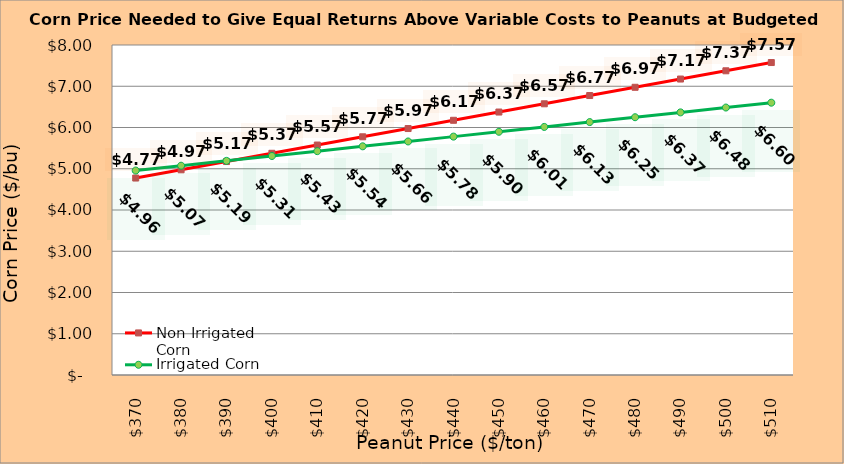
| Category | Non Irrigated Corn | Irrigated Corn |
|---|---|---|
| 370.0 | 4.775 | 4.956 |
| 380.0 | 4.975 | 5.074 |
| 390.0 | 5.175 | 5.191 |
| 400.0 | 5.375 | 5.309 |
| 410.0 | 5.575 | 5.426 |
| 420.0 | 5.775 | 5.544 |
| 430.0 | 5.975 | 5.661 |
| 440.0 | 6.175 | 5.779 |
| 450.0 | 6.375 | 5.896 |
| 460.0 | 6.575 | 6.014 |
| 470.0 | 6.775 | 6.131 |
| 480.0 | 6.975 | 6.249 |
| 490.0 | 7.175 | 6.366 |
| 500.0 | 7.375 | 6.484 |
| 510.0 | 7.575 | 6.601 |